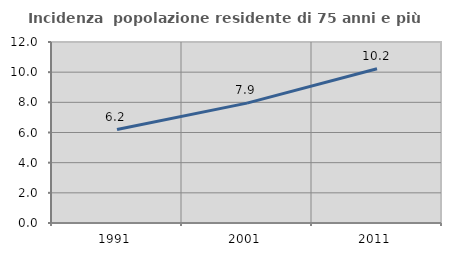
| Category | Incidenza  popolazione residente di 75 anni e più |
|---|---|
| 1991.0 | 6.199 |
| 2001.0 | 7.949 |
| 2011.0 | 10.228 |